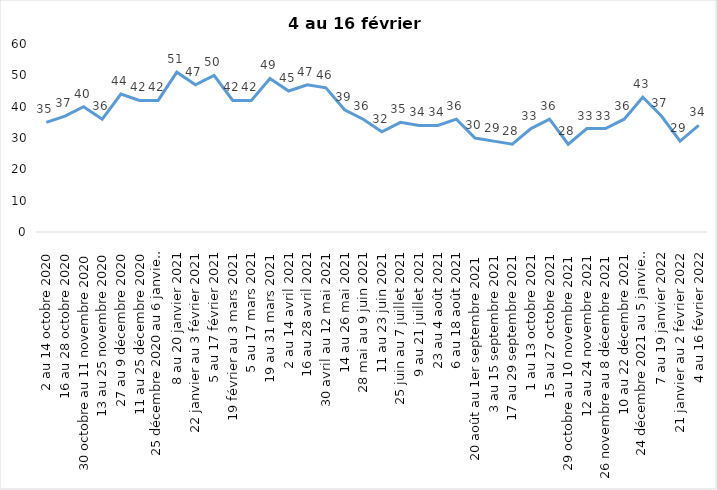
| Category | Toujours aux trois mesures |
|---|---|
| 2 au 14 octobre 2020 | 35 |
| 16 au 28 octobre 2020 | 37 |
| 30 octobre au 11 novembre 2020 | 40 |
| 13 au 25 novembre 2020 | 36 |
| 27 au 9 décembre 2020 | 44 |
| 11 au 25 décembre 2020 | 42 |
| 25 décembre 2020 au 6 janvier 2021 | 42 |
| 8 au 20 janvier 2021 | 51 |
| 22 janvier au 3 février 2021 | 47 |
| 5 au 17 février 2021 | 50 |
| 19 février au 3 mars 2021 | 42 |
| 5 au 17 mars 2021 | 42 |
| 19 au 31 mars 2021 | 49 |
| 2 au 14 avril 2021 | 45 |
| 16 au 28 avril 2021 | 47 |
| 30 avril au 12 mai 2021 | 46 |
| 14 au 26 mai 2021 | 39 |
| 28 mai au 9 juin 2021 | 36 |
| 11 au 23 juin 2021 | 32 |
| 25 juin au 7 juillet 2021 | 35 |
| 9 au 21 juillet 2021 | 34 |
| 23 au 4 août 2021 | 34 |
| 6 au 18 août 2021 | 36 |
| 20 août au 1er septembre 2021 | 30 |
| 3 au 15 septembre 2021 | 29 |
| 17 au 29 septembre 2021 | 28 |
| 1 au 13 octobre 2021 | 33 |
| 15 au 27 octobre 2021 | 36 |
| 29 octobre au 10 novembre 2021 | 28 |
| 12 au 24 novembre 2021 | 33 |
| 26 novembre au 8 décembre 2021 | 33 |
| 10 au 22 décembre 2021 | 36 |
| 24 décembre 2021 au 5 janvier 2022 2022 | 43 |
| 7 au 19 janvier 2022 | 37 |
| 21 janvier au 2 février 2022 | 29 |
| 4 au 16 février 2022 | 34 |